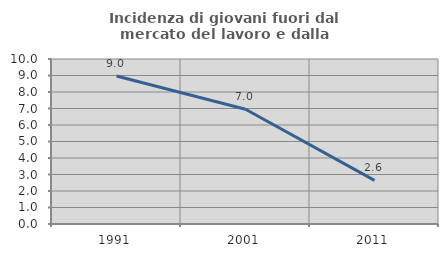
| Category | Incidenza di giovani fuori dal mercato del lavoro e dalla formazione  |
|---|---|
| 1991.0 | 8.972 |
| 2001.0 | 6.958 |
| 2011.0 | 2.644 |